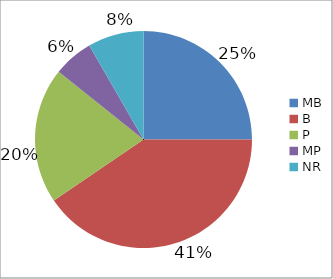
| Category | Series 0 |
|---|---|
| MB | 0.25 |
| B | 0.405 |
| P | 0.202 |
| MP | 0.06 |
| NR | 0.083 |